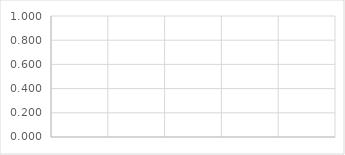
| Category | Series 0 |
|---|---|
| Træpiller | 0 |
| Brænde | 0 |
| Flis | 0 |
| Halm | 0 |
| Olie | 0 |